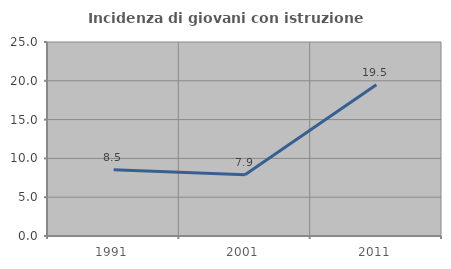
| Category | Incidenza di giovani con istruzione universitaria |
|---|---|
| 1991.0 | 8.543 |
| 2001.0 | 7.884 |
| 2011.0 | 19.492 |